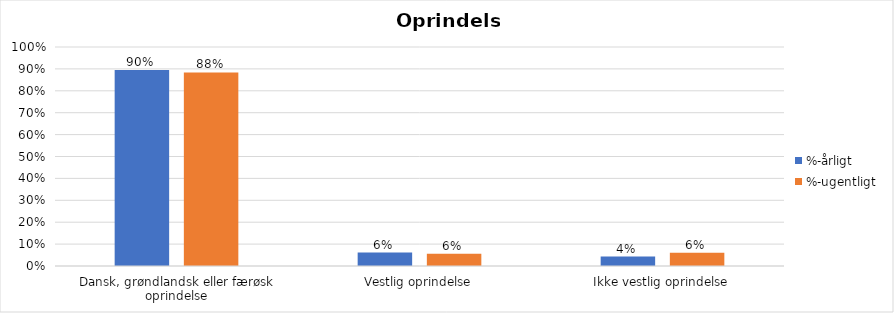
| Category | %-årligt | %-ugentligt |
|---|---|---|
| Dansk, grøndlandsk eller færøsk oprindelse | 0.895 | 0.884 |
| Vestlig oprindelse | 0.061 | 0.056 |
| Ikke vestlig oprindelse | 0.043 | 0.06 |